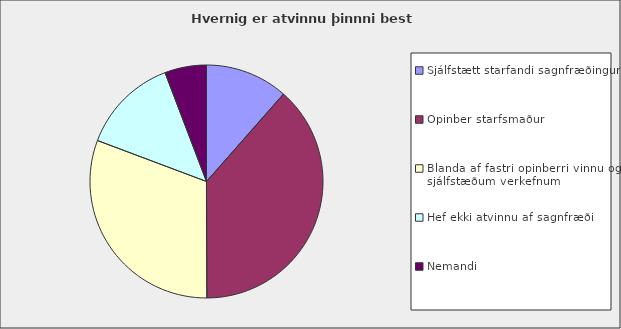
| Category | Series 0 |
|---|---|
| Sjálfstætt starfandi sagnfræðingur | 0.115 |
| Opinber starfsmaður | 0.385 |
| Blanda af fastri opinberri vinnu og sjálfstæðum verkefnum | 0.308 |
| Hef ekki atvinnu af sagnfræði | 0.135 |
| Nemandi | 0.058 |